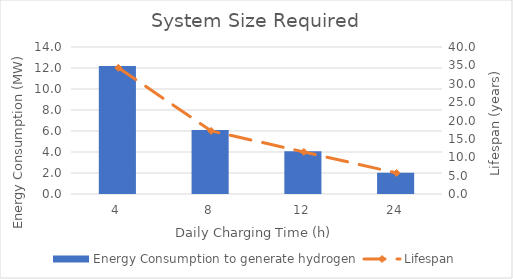
| Category | Energy Consumption to generate hydrogen |
|---|---|
| 4.0 | 12.188 |
| 8.0 | 6.094 |
| 12.0 | 4.062 |
| 24.0 | 2.031 |